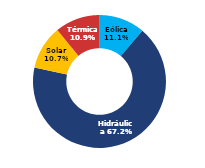
| Category | Sur |
|---|---|
| Eólica | 71.026 |
| Hidráulica | 428.555 |
| Solar | 68.403 |
| Térmica | 69.608 |